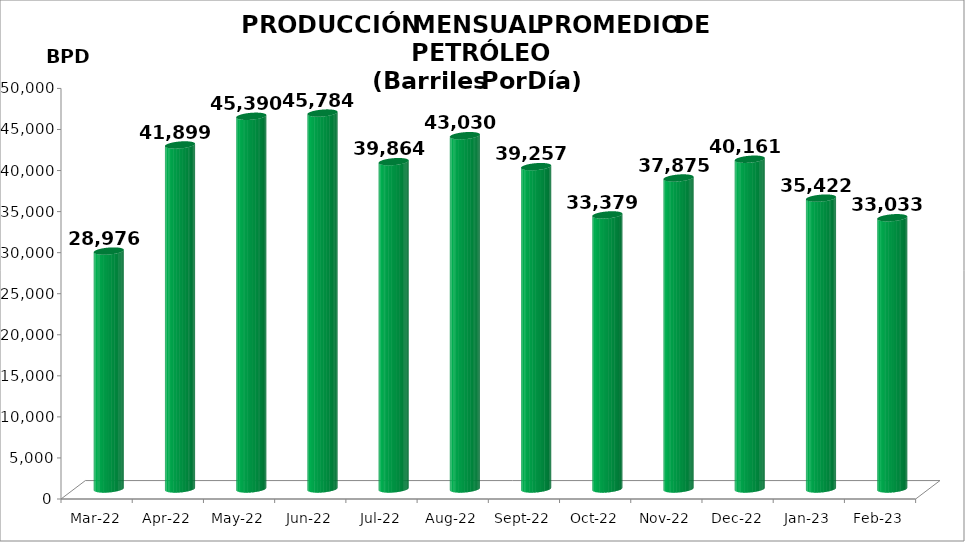
| Category | Series 0 |
|---|---|
| 2022-03-01 | 28976.419 |
| 2022-04-01 | 41899 |
| 2022-05-01 | 45390.387 |
| 2022-06-01 | 45784.1 |
| 2022-07-01 | 39863.677 |
| 2022-08-01 | 43030.065 |
| 2022-09-01 | 39257.333 |
| 2022-10-01 | 33379.161 |
| 2022-11-01 | 37875.067 |
| 2022-12-01 | 40161.226 |
| 2023-01-01 | 35421.677 |
| 2023-02-01 | 33033.429 |